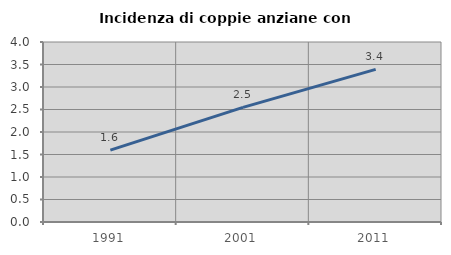
| Category | Incidenza di coppie anziane con figli |
|---|---|
| 1991.0 | 1.598 |
| 2001.0 | 2.548 |
| 2011.0 | 3.392 |